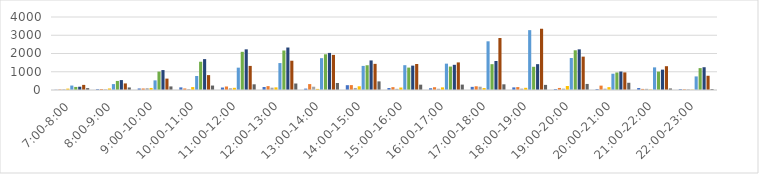
| Category | Series 0 | Series 1 | Series 2 | Series 3 | Series 4 | Series 5 | Series 6 | Series 7 | Series 8 |
|---|---|---|---|---|---|---|---|---|---|
| 7:00-8:00 | 12 | 28 | 36 | 76 | 244 | 168 | 180 | 280 | 104 |
| 8:00-9:00 | 48 | 56 | 36 | 84 | 324 | 496 | 544 | 360 | 140 |
| 9:00-10:00 | 84 | 84 | 96 | 112 | 528 | 1008 | 1092 | 624 | 196 |
| 10:00-11:00 | 144 | 84 | 48 | 160 | 768 | 1548 | 1692 | 816 | 244 |
| 11:00-12:00 | 136 | 192 | 96 | 120 | 1224 | 2092 | 2228 | 1320 | 312 |
| 12:00-13:00 | 164 | 212 | 128 | 144 | 1476 | 2164 | 2328 | 1604 | 356 |
| 13:00-14:00 | 76 | 324 | 180 | 60 | 1744 | 1956 | 2032 | 1924 | 384 |
| 14:00-15:00 | 264 | 268 | 112 | 204 | 1320 | 1356 | 1620 | 1432 | 472 |
| 15:00-16:00 | 108 | 156 | 64 | 136 | 1360 | 1228 | 1336 | 1424 | 292 |
| 16:00-17:00 | 96 | 152 | 68 | 144 | 1444 | 1284 | 1380 | 1512 | 296 |
| 17:00-18:00 | 172 | 204 | 180 | 108 | 2668 | 1416 | 1588 | 2848 | 312 |
| 18:00-19:00 | 144 | 160 | 76 | 120 | 3280 | 1272 | 1416 | 3356 | 280 |
| 19:00-20:00 | 52 | 112 | 76 | 220 | 1752 | 2176 | 2228 | 1828 | 332 |
| 20:00-21:00 | 52 | 240 | 72 | 156 | 892 | 960 | 1012 | 964 | 396 |
| 21:00-22:00 | 108 | 60 | 64 | 24 | 1240 | 1008 | 1116 | 1304 | 84 |
| 22:00-23:00 | 48 | 36 | 36 | 20 | 744 | 1200 | 1248 | 780 | 56 |